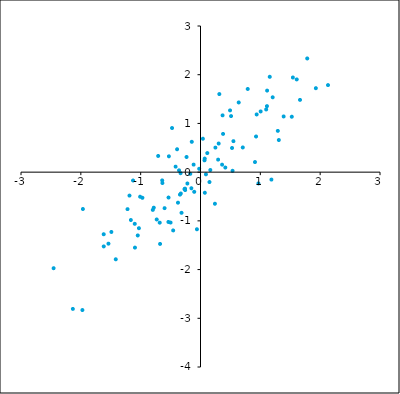
| Category | Series 0 |
|---|---|
| 0.493659108474693 | 1.268 |
| 0.928011405945098 | 0.732 |
| -1.416248188885949 | -1.789 |
| 0.248738895104601 | 0.504 |
| 1.30906815713883 | 0.659 |
| 1.292195528029246 | 0.847 |
| 1.005331738345501 | 1.246 |
| -1.029139951398274 | -1.151 |
| 0.0725634686475463 | -0.423 |
| 0.360910971165669 | 0.154 |
| -0.34317233839548 | -0.462 |
| -0.358877903988331 | 0.037 |
| -0.0592859508162683 | -1.172 |
| 0.706397175291438 | 0.506 |
| 1.185231544366857 | -0.153 |
| 0.414872741108482 | 0.095 |
| -1.538463015805269 | -1.468 |
| -1.617502667239724 | -1.275 |
| -1.163876646279268 | -0.983 |
| 0.52718525851667 | 0.496 |
| 0.0704470600782114 | 0.279 |
| -0.317008740161598 | -0.835 |
| 0.910808570319312 | 0.208 |
| -2.133246358959332 | -2.807 |
| -2.45494694984338 | -1.972 |
| 0.303768622820291 | 0.587 |
| -1.048558532729864 | -1.3 |
| 1.783845775484606 | 2.334 |
| 0.639079593075266 | 1.43 |
| -1.186987844269642 | -0.481 |
| 1.928001443290814 | 1.723 |
| -0.256464270004647 | -0.369 |
| -0.104802195388985 | -0.404 |
| -0.534235556180043 | -0.521 |
| -0.640374354224191 | -0.169 |
| -0.23354873172751 | 0.311 |
| 0.510709884904931 | 1.15 |
| 0.164197148765219 | 0.043 |
| 0.294505497584118 | 0.257 |
| 1.389706141312117 | 1.143 |
| -0.536551750799354 | -1.022 |
| 0.040267843450152 | 0.686 |
| -0.115074561151116 | 0.154 |
| -1.219649981420835 | -0.76 |
| -1.095224255410715 | -1.549 |
| 1.097400230403283 | 1.287 |
| -0.416053346832657 | 0.113 |
| -0.528337932507709 | 0.325 |
| -1.965429142013695 | -0.757 |
| -0.328649182654112 | -0.439 |
| -0.781194957417445 | -0.73 |
| -0.797165070325975 | -0.775 |
| 2.130849773389183 | 1.787 |
| 0.150281997505871 | -0.203 |
| -0.50014881566308 | -1.035 |
| -0.636667884715854 | -0.223 |
| -1.973684883479857 | -2.831 |
| -1.617026646563664 | -1.525 |
| -0.219116965508858 | -0.233 |
| 1.544245655296427 | 1.943 |
| -0.707423779753455 | 0.332 |
| -0.258331840690112 | -0.338 |
| 1.206609768399359 | 1.536 |
| -0.0218283464881984 | 0.069 |
| -1.098859386476834 | -1.061 |
| 0.377120522010437 | 0.785 |
| 0.369044525704924 | 1.166 |
| -0.970611274262676 | -0.527 |
| -1.127664172840415 | -0.172 |
| -0.600313373698655 | -0.739 |
| 0.314638162996019 | 1.603 |
| 0.789560075275349 | 1.707 |
| 1.662900945008352 | 1.484 |
| -0.171518803504808 | -0.036 |
| -0.675630702849851 | -1.473 |
| -0.152418319106695 | -0.331 |
| -0.391617383359133 | 0.47 |
| 1.110973289531175 | 1.355 |
| -1.489448092090705 | -1.228 |
| -0.681388606970141 | -1.037 |
| 1.608443925480278 | 1.903 |
| 0.535697036299811 | 0.028 |
| -0.475786425671135 | 0.906 |
| 0.113297126072253 | 0.391 |
| 0.0909389362705235 | -0.045 |
| 1.525589425775312 | 1.138 |
| 0.938825233945791 | 1.184 |
| -0.267338988557561 | -0.347 |
| -0.731666864858453 | -0.972 |
| 1.15747623149655 | 1.957 |
| 0.550383777422376 | 0.636 |
| 0.968333322827652 | -0.232 |
| -1.009516187111263 | -0.505 |
| 1.113296396847002 | 1.674 |
| 0.24113679511695 | -0.649 |
| 0.0666689174294332 | 0.242 |
| -0.332689118109286 | -0.022 |
| -0.456647547552639 | -1.197 |
| -0.145821581686313 | 0.623 |
| -0.376263429119849 | -0.627 |